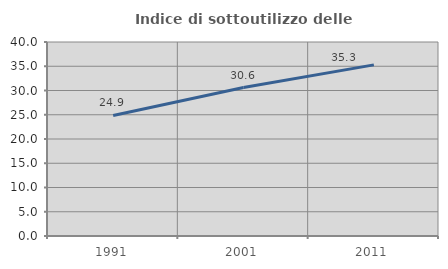
| Category | Indice di sottoutilizzo delle abitazioni  |
|---|---|
| 1991.0 | 24.858 |
| 2001.0 | 30.608 |
| 2011.0 | 35.283 |